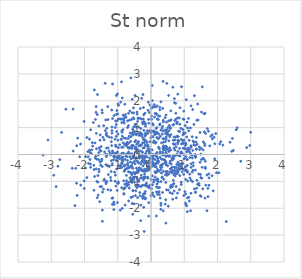
| Category | Series 0 |
|---|---|
| -1.3569650203321348 | -0.379 |
| 0.006356040473439961 | -0.929 |
| 0.8148992307994369 | -0.633 |
| 0.04914036007806821 | 1.147 |
| 0.7065708399965507 | -0.477 |
| 1.0996796094767545 | 0.991 |
| 0.19282079562782428 | -1.482 |
| -0.03461975269364714 | 0.86 |
| 0.671788227664889 | 0.401 |
| -1.106565954318019 | -1.856 |
| -0.4590218435995874 | -1.163 |
| -0.5738741017841402 | -1.031 |
| 1.328260649342905 | 0.003 |
| 0.9598398278082749 | 0.928 |
| -0.10118900537914133 | -0.599 |
| -1.5026205602880651 | 0.134 |
| 0.6862633648643675 | -1.079 |
| 0.9495481328740167 | 0.519 |
| 0.19692176842302533 | -0.558 |
| -0.7882388213198581 | 1.871 |
| 0.7043078636196238 | 2.08 |
| -0.4103651872947349 | 0.784 |
| 1.3653940784192162 | 0.206 |
| 0.8031301679113474 | 0.395 |
| 1.0600271277994917 | 2.04 |
| 1.2528530756783285 | 1.675 |
| 1.1362462216888245 | 0.881 |
| -1.2568011099916863 | -0.44 |
| -0.7914838416924264 | -1.244 |
| 0.9108364341493704 | -0.342 |
| 0.807118988078674 | 0.457 |
| 0.12080695868342506 | -0.187 |
| -2.7433004410158253 | -0.193 |
| 0.2002037047067473 | -0.241 |
| 1.5185559602940506 | 1.579 |
| 1.555214914672412 | -0.14 |
| 0.28294432959679217 | 0.683 |
| -2.558783319268257 | 1.685 |
| -0.710855905186107 | 0.367 |
| 0.3525347179412659 | 1.715 |
| -0.5808574724087103 | -0.399 |
| -0.8364611551904035 | 0.279 |
| 0.17087346446996143 | 1.489 |
| -0.19563439505006386 | -0.325 |
| -1.5664046584031377 | -0.553 |
| -0.030903933906101244 | 0.064 |
| -0.39129987650884956 | 1.337 |
| 0.0031459721022430998 | -0.044 |
| -2.144437188149859 | -0.085 |
| -0.1046991852085819 | -0.856 |
| -1.0034448918451169 | -0.086 |
| 1.1654362814987778 | -0.115 |
| -1.7540181281621852 | 0.311 |
| -0.679229379894859 | -0.641 |
| 1.8404018918960974 | 0.732 |
| 0.5796670368642882 | -0.544 |
| -0.2070027178607834 | -1.591 |
| -0.7319070663677847 | -0.976 |
| 0.91039075943109 | -0.477 |
| 2.0412393491312297 | -0.68 |
| -0.18899029103460663 | -0.289 |
| 1.204709160239024 | 0.009 |
| 0.6717195258271129 | -0.961 |
| 1.040500877615191 | -1.807 |
| -0.7853011980402105 | -0.407 |
| -1.0955542118806791 | -0.04 |
| -0.1586011173040589 | -1.628 |
| -0.4962520945124895 | -1.036 |
| -0.981333639614121 | -1.02 |
| -0.842064161357599 | 1.468 |
| 0.3835170772631322 | 0.177 |
| -3.0983232618258425 | 0.538 |
| 2.590603917351956 | 0.995 |
| 1.4532276110866071 | 0.28 |
| 0.5674830210801796 | -0.059 |
| -1.7646560157441673 | 0.441 |
| 0.5970841817975945 | 0.739 |
| 0.01939545836672618 | 1.305 |
| 1.3546970831572116 | 0.467 |
| 0.6826008580655811 | 1.117 |
| 1.4370740384418248 | -1.08 |
| -0.8149376009017271 | -1.455 |
| -0.2864518141983021 | -0.092 |
| -0.11429622696074304 | 0.316 |
| -0.5786931852286017 | -0.756 |
| -0.3055631367314442 | -1.882 |
| 0.8249430991804791 | -0.413 |
| 0.8420430736593909 | 0.505 |
| -0.3210313439767365 | 1.711 |
| 0.9890970320306449 | 0.772 |
| 0.7637245482020916 | -0.488 |
| -0.8639692721415351 | 2.102 |
| 0.18377636989333368 | -0.642 |
| -0.8823612111811112 | -1.236 |
| -1.542984723063137 | -1.755 |
| 0.356756857927496 | 0.079 |
| -2.008568444538983 | -0.982 |
| 1.3328812047494765 | -0.06 |
| 0.29787308365173626 | -1.005 |
| 0.21934793240234995 | -1.02 |
| 0.3463396989648677 | -1.413 |
| -1.0358017163294795 | -0.206 |
| -0.4838926365272611 | -0.727 |
| 1.2643684481030881 | -0.585 |
| -1.015224539292607 | -1.335 |
| 0.27540433459510716 | -1.619 |
| -1.5581904528860395 | 0.245 |
| 0.8628572167440041 | 0.857 |
| 1.5686674717828204 | 0.171 |
| 0.37112721158568984 | 0.183 |
| -0.07257727977033568 | 1.305 |
| -0.1200977932865337 | 0.449 |
| -0.08333788853140245 | -0.482 |
| -0.17324948049165645 | 0.7 |
| -0.8756405087615367 | -0.211 |
| 0.1775344771091234 | 0.829 |
| 2.5644699277990437 | 0.922 |
| -0.4597219029816948 | 0.522 |
| -0.20551400202101533 | -0.63 |
| 0.12580574859873117 | -0.36 |
| 0.5713162177043278 | 1.01 |
| 1.8710760869010556 | -1.355 |
| -1.4133741205979584 | -0.966 |
| -1.032052030066323 | -0.23 |
| 0.6646641497285906 | -1.116 |
| 1.0903247404691871 | -0.19 |
| 0.4761044203867115 | 2.646 |
| 0.7444088316903876 | 1.903 |
| -2.0112183899333997 | 1.228 |
| -0.14618302166071295 | -0.079 |
| 0.16921521325629474 | -0.064 |
| 0.03995161930661162 | -0.793 |
| 0.4578228455276294 | -0.367 |
| 0.4664716923237586 | -0.706 |
| 1.0017752823133996 | 0.233 |
| -1.6145173328592373 | 1.484 |
| -1.8873444617791364 | -0.088 |
| 0.2321729815499225 | 0.76 |
| -0.42101674483554685 | 1.581 |
| -1.5740797654693983 | -0.196 |
| -0.19327168677371276 | -0.007 |
| -0.6944435965257592 | 0.26 |
| 0.19702453567939138 | -0.618 |
| -0.3899118153615362 | -0.657 |
| -0.25163121907946984 | 0.436 |
| 0.2666616192376461 | 1.661 |
| -0.09485576777742821 | -0.326 |
| -0.4405971734120815 | 1.017 |
| 0.3384891708457465 | 0.006 |
| 0.050839637186568254 | -0.433 |
| 0.2663168848057156 | 1.758 |
| -0.22686557085535863 | 1.746 |
| 0.7558686001838257 | 0.279 |
| 0.6980457688738992 | -0.032 |
| 0.2062310480901326 | -0.306 |
| -0.14991267719938683 | 0.51 |
| -0.21125973277107413 | -0.845 |
| -0.3003824027320503 | -0.361 |
| 0.2980006424915267 | -1.813 |
| 0.08738917168113147 | 0.863 |
| -0.2745075608604237 | 0.102 |
| -0.0796968138808909 | 1.944 |
| 0.12426326788083397 | -0.013 |
| -1.4655700322920762 | 1.553 |
| 1.0199995960614388 | -1.382 |
| -1.3749309435690193 | 0.888 |
| 1.9155449809798277 | -0.162 |
| -1.1643241245564626 | 0.025 |
| -1.1306168575364177 | -0.198 |
| -0.6851075945304927 | 0.592 |
| 0.8715544613965545 | 1.741 |
| -1.1734631151761414 | 0.794 |
| 0.6448661031104397 | -0.156 |
| -0.36205575551163083 | 0.316 |
| 1.0927785065771074 | -2.125 |
| -0.48884688076941885 | 0.785 |
| -1.0290841223338045 | -0.536 |
| -0.8149125576553597 | -1.475 |
| -0.043848368878236066 | -0.493 |
| 0.4650915551428936 | 0.821 |
| -0.17392629078604216 | 0.787 |
| -0.1388889697815925 | -1.09 |
| -2.2202502793864642 | -1.522 |
| -0.5681282796367029 | 0.235 |
| -1.7161162259796967 | -1.332 |
| 1.4763447354538952 | -0.293 |
| -1.2139705324194443 | -0.855 |
| -0.4469453380708419 | 0.734 |
| -0.7927537529023105 | 1.405 |
| 0.15458029293942133 | 1.524 |
| 0.45438003053593157 | -0.387 |
| 0.032427157806004026 | 1.732 |
| 0.18367150859286419 | 0.806 |
| 0.9878870664891153 | 1.613 |
| 0.7387643172796725 | 0.645 |
| 0.8300857416904757 | 0.866 |
| -0.8149269265208972 | 1.33 |
| -0.06881849942841001 | -1.223 |
| -0.22058226168801465 | 1.479 |
| 0.446679390481032 | -0.024 |
| -1.5297627290415274 | -0.279 |
| -0.1994223044123018 | 0.258 |
| 0.37206134702960725 | 1.215 |
| 1.495333496889157 | -0.86 |
| -1.3289428661624907 | 0.977 |
| 0.9097615339422847 | -1.03 |
| -1.719306095122283 | -0.401 |
| -0.24660894753896567 | -0.071 |
| -0.03400142318483379 | 1.839 |
| 2.374838114780786 | 0.455 |
| -0.8401790997057308 | -0.241 |
| 0.29512080582486355 | -2.037 |
| -0.20078954687226425 | -0.553 |
| -2.342383188233569 | 1.689 |
| -0.19395534265980086 | -0.733 |
| -0.06820275241850648 | -1.793 |
| 1.135940656186003 | -1.591 |
| -0.006781675103190388 | 0.618 |
| -0.9382736289784122 | -0.426 |
| -1.6501770631185586 | 1.785 |
| -1.1560484516813583 | 2.622 |
| 0.0916183563652373 | 0.827 |
| -1.1204660357170741 | -1.77 |
| -0.4734719483342813 | 1.101 |
| -0.7987815588056772 | -0.432 |
| 0.45487909951630545 | -0.294 |
| -1.7786689394177797 | 0.172 |
| 1.2687928035628833 | -0.308 |
| 0.1591088896695778 | 0.023 |
| -1.254141704212043 | -0.441 |
| 0.11180195366978296 | -0.448 |
| 0.27866633678066055 | 0.102 |
| -0.22162174291727865 | 0.593 |
| 1.3999324533436353 | -1.11 |
| -0.2545877841741051 | -0.217 |
| 0.6434814032128351 | -0.204 |
| 1.3337582851999334 | -1.408 |
| -0.10022527710954687 | 0.358 |
| 0.4489807956637204 | 0.311 |
| -0.40722238954236367 | -0.57 |
| -0.389737338265852 | -1.161 |
| -0.3345099033839034 | 0.34 |
| -0.2298253984235643 | 1.319 |
| 0.8918686343393887 | 0.055 |
| 0.3110841351803062 | -0.172 |
| -0.17920375739778827 | 1.137 |
| -0.26815697819640505 | 0.75 |
| 1.4345374995352342 | -0.725 |
| 0.27109453220482305 | -0.101 |
| -2.688863391053198 | 0.821 |
| -1.4624618209609235 | -2.068 |
| -0.7389304169857205 | -0.778 |
| 1.597516759096953 | -0.172 |
| 0.8317721069067847 | -0.032 |
| -0.1703082536020597 | -1.377 |
| 0.04063326769772235 | 2.004 |
| 0.362202558265059 | 0.214 |
| -0.6181330236262861 | -0.279 |
| 1.1645045761463626 | 0.083 |
| 2.968900739700363 | 0.337 |
| -0.2945304366403185 | -0.768 |
| -0.8815685132368696 | 0.263 |
| 0.502810108682433 | -0.422 |
| 0.05775610180297619 | 0.655 |
| -0.5114572054452688 | 1.326 |
| 0.7285537345856721 | -0.798 |
| 1.3606156868743007 | 0.189 |
| -0.8395399992619348 | 0.925 |
| 0.2433801158409814 | 0.242 |
| 0.027201288687796144 | 0.174 |
| -0.20558685613520566 | -2.862 |
| 1.043115016500237 | -0.926 |
| -0.4786161485938294 | -0.712 |
| 0.9835464379817074 | 0.81 |
| -0.34470653594922585 | -0.582 |
| -1.3334461049609931 | -1.001 |
| 1.0254961978952561 | -0.469 |
| -0.8922813723107197 | 0.567 |
| -1.8515456132976649 | 0.572 |
| 0.8748611411727492 | -0.059 |
| 1.2003399392597647 | -1.444 |
| 0.9243790728020631 | 0.064 |
| -0.8391832738809573 | -0.089 |
| -0.7163378007539025 | 0.454 |
| -0.6001643323499337 | -1.6 |
| -2.26521576289394 | -0.512 |
| -1.6465182993535876 | 0.787 |
| -0.933415094509118 | 1.326 |
| 0.14879651897364887 | 0.766 |
| 1.096039661845193 | -0.655 |
| -0.8622249292282316 | 0.681 |
| -0.25740979747856585 | 1.187 |
| 0.3166759182671477 | 0.432 |
| -0.35251166129040445 | -0.494 |
| -1.6084403427528988 | 2.231 |
| -0.15255478671634215 | -0.607 |
| -0.7514076494285034 | 1.382 |
| -0.25663130827934033 | 0.081 |
| 0.1800897645984305 | -0.297 |
| -0.6275305656398364 | 0.797 |
| 0.37728700558763517 | 0.324 |
| -0.09114574505353534 | 0.21 |
| -1.0400191756299808 | 0.064 |
| 0.15420685548065105 | 1.772 |
| -0.9088653474915906 | -0.491 |
| -1.8794873447995384 | -0.33 |
| -0.9946792161274285 | 0.533 |
| -0.5757318717760294 | -1.035 |
| 0.960734780546006 | -0.334 |
| 1.4877614101535919 | -0.744 |
| 0.6968035846690022 | -1.359 |
| 1.618946071910492 | 0.331 |
| 1.0852917971216263 | 1.206 |
| -0.16393808058719994 | 1.054 |
| -0.7741367884599697 | -0.181 |
| 0.5884055215407908 | 0.968 |
| -0.4681889705198232 | -1.526 |
| 1.2639653907782158 | 0.506 |
| -0.4212422992931275 | -0.872 |
| 0.8662614206129549 | -0.785 |
| 1.0924810777085776 | -0.407 |
| -0.09046267429745392 | 1.647 |
| -2.2384407911941433 | -1.07 |
| 0.791834963286961 | -0.684 |
| 0.12528923303936335 | -0.84 |
| -0.33977470661820863 | 0.797 |
| -1.041194072682516 | 1.493 |
| 2.8796103253241796 | 0.259 |
| 0.17528265381005337 | 0.632 |
| -1.8436710022769542 | 0.084 |
| 0.4274245987630927 | -0.231 |
| -0.5841629587515982 | -0.443 |
| 0.3273257334833426 | -0.473 |
| -0.23834630103560261 | 2.232 |
| -0.9084849881761858 | 1.316 |
| 0.5413274536144002 | 0.883 |
| 0.03981146252362677 | -1.489 |
| -1.5967317974248454 | -0.782 |
| 0.267418756952722 | 0.057 |
| -0.6090129839345879 | -0.931 |
| 0.44955134400121377 | 0.081 |
| -0.024671016009597757 | -1.138 |
| 0.4343590803510038 | 0.171 |
| 0.1442523515874754 | -0.368 |
| -0.5268556666548836 | -0.664 |
| 0.9352145235506537 | -0.647 |
| 0.3748609234667786 | -0.628 |
| -1.0236381631932945 | 1.634 |
| -0.5866729513811171 | 1.301 |
| -0.37784251369667743 | -0.585 |
| -0.570859990960705 | 1.552 |
| -1.1829473780507955 | 0.332 |
| -1.1971450231351382 | -0.635 |
| -1.0370727290206423 | 0.053 |
| 0.19293006913598099 | -0.262 |
| -0.742740885672168 | 0.007 |
| -1.3187465758035053 | 0.691 |
| 0.4448549233622163 | -1.04 |
| -0.13623391988483835 | -1.071 |
| 1.463907543147963 | 0.183 |
| 0.7847122996926004 | 0.681 |
| -1.5337274982554892 | 0.16 |
| 1.7402444595352273 | -0.723 |
| -0.8863132341577584 | 2.704 |
| 1.510611918865325 | 0.232 |
| 0.5443692646014924 | 0.149 |
| -0.6765482020805438 | 1.532 |
| 1.0718413398494393 | -1.911 |
| -0.6763589811141051 | 1.073 |
| -1.2941865925648068 | 1.297 |
| -0.05265347393474684 | 0.883 |
| -0.5185953439340842 | -0.905 |
| 0.5998799900317611 | -1.223 |
| -0.568943626587437 | 0.028 |
| -0.12495195857430286 | -0.084 |
| 0.7564860418200166 | 1.325 |
| -0.9855905141354846 | 1.318 |
| -0.522438254044423 | 0.324 |
| 0.3859516926858042 | -0.924 |
| 0.9902723187265075 | -0.166 |
| 2.4299417083595856 | 0.116 |
| -0.4356830900167292 | -0.506 |
| 0.640524738606584 | -1.199 |
| 0.6666091894088488 | -0.144 |
| -0.6521915658224513 | -1.25 |
| -0.23611255946540943 | -0.424 |
| 0.25067663907994486 | 0.214 |
| -0.2130971378054065 | 0.899 |
| 0.8053316844995635 | 0.532 |
| 0.25444913231714317 | -1.493 |
| -0.3686370128955705 | -0.316 |
| -1.5861710595597387 | -1.512 |
| -0.0315862150373194 | -0.494 |
| -0.5198222979466207 | -0.931 |
| -0.9902083086782687 | -0.071 |
| 0.4475125193359979 | -2.551 |
| -0.39789260373760005 | -0.273 |
| -1.4566299340724083 | -1.398 |
| 1.7135402599272114 | -1.568 |
| -1.4799041681625917 | -0.175 |
| -0.41636258953774963 | 1.501 |
| -0.9391466333202425 | 0.363 |
| -1.046320235889258 | 1.118 |
| -0.44252447687775387 | 0.087 |
| -0.17548777549610062 | 0.696 |
| 1.575279919592619 | 0.468 |
| -0.04994418908231246 | -0.317 |
| 1.0963065594414534 | -1.614 |
| -1.4442916391899763 | 0.639 |
| 1.8446758546354092 | 0.582 |
| -1.628602744154306 | -1.005 |
| 1.1040370764666179 | 0.239 |
| -0.09734027856574468 | 0.787 |
| -0.5392322418235782 | -1.35 |
| -0.6479069126455244 | -0.492 |
| -1.8219954852608788 | -0.355 |
| -0.17777130082683623 | 0.342 |
| -2.9238276405078207 | -0.771 |
| -0.2101687013839415 | -1.139 |
| 0.356896262934578 | -0.182 |
| 0.8353419160284155 | -0.52 |
| 0.06329468755391598 | -0.165 |
| -0.4764000445180958 | -0.348 |
| 0.969310679614865 | 0.41 |
| 0.5660899267427331 | 0.657 |
| -1.8484130919071164 | 0.164 |
| -0.7689661504584429 | -0.558 |
| 1.2035125921695204 | -0.955 |
| -0.19259013468334096 | -0.321 |
| 1.0283137306157695 | 1.075 |
| -0.6257837530309294 | -0.661 |
| -0.749566117114659 | 0.391 |
| -0.05560723391617017 | -0.565 |
| 0.960331781002564 | 0.732 |
| 1.767424808381599 | 0.322 |
| -0.37466009811275036 | -0.949 |
| -1.1744917589433541 | 0.892 |
| -0.36105018464578276 | 0.709 |
| -0.49569360382947725 | -0.251 |
| -0.25770508577819484 | -1.569 |
| -0.6577890138587783 | 0.681 |
| -0.8641014448609132 | -0.339 |
| 0.1839302275606789 | 1.81 |
| 0.7473124373674587 | 1.534 |
| -0.246886799930226 | -1.633 |
| -0.7932078688160153 | -1.258 |
| 1.9477987460746595 | 0.781 |
| -1.3012866632064828 | 1.782 |
| -1.533002255244842 | 0.533 |
| -0.2805369379963709 | 2.091 |
| 0.10760828038276582 | 1.392 |
| -0.6060086813150196 | 2.85 |
| 2.1606963232695584 | 0.348 |
| 0.28843328774679033 | -0.474 |
| 2.0681844684098323 | 0.395 |
| 0.2582064082142388 | 1.104 |
| -1.1714684879804498 | -1.631 |
| -1.0101834158967176 | 2.251 |
| 0.3873488500660889 | 0.594 |
| -1.0313587735327534 | 0.856 |
| 0.47265688925231153 | 0.837 |
| 0.01742966692255532 | 0.889 |
| 0.6088136343068786 | -0.641 |
| 0.27248096123008025 | 1.138 |
| 0.5957069820441889 | 1.623 |
| -0.18537493034689323 | -0.122 |
| 0.21098016034790223 | -1.236 |
| 1.6283709725845386 | 1.532 |
| -2.118985717150946 | 0.388 |
| 0.014712059637290942 | 1.433 |
| 1.6053500377270256 | 0.844 |
| -1.6654276511887849 | -0.071 |
| -1.1221057451059577 | -0.08 |
| -0.8657571029591367 | -2.005 |
| -1.583759487340667 | -0.019 |
| -0.0707639179404822 | -2.293 |
| 0.38151574509154784 | 0.462 |
| 0.5779557223261236 | -0.652 |
| 0.24811857320001351 | -0.621 |
| -0.6228532208089863 | 0.02 |
| 0.7167294497838652 | 1.267 |
| -1.0104065919391134 | -1.788 |
| -0.9361462462310071 | -0.148 |
| 1.3688976867558136 | 0.635 |
| -0.926741792910037 | -2.071 |
| -0.44064166259902215 | 0.22 |
| 0.7735137646827379 | -0.367 |
| 0.12191473913954809 | 0.84 |
| -1.1559206109729816 | 1.338 |
| 0.9659681798938422 | 0.433 |
| 1.3414728055495546 | -0.102 |
| 1.9698732481567571 | -0.678 |
| -1.5658075095292272 | 1.057 |
| -1.9291926926921255 | 0.632 |
| 0.5869296552083743 | -1.215 |
| -0.9767809996907557 | 1.832 |
| 0.12932891350230946 | 0.42 |
| 0.18996217721528108 | 1.318 |
| -1.1601040711354385 | -1.858 |
| 0.36840009864699663 | 1.274 |
| 0.10332764863658284 | 1.779 |
| 0.3276915665490119 | -0.385 |
| 0.5985964341741266 | -0.518 |
| 0.050022944263217184 | 1.772 |
| -0.4028954274028038 | 1.231 |
| -0.27087713204278785 | 0.664 |
| 0.9021929242821951 | 0.972 |
| 0.7185240007111116 | 0.164 |
| 0.6672519167468067 | 0.532 |
| 0.9877804299275166 | -0.003 |
| 0.8223812475464394 | 0.661 |
| 0.39647992848104696 | 0.249 |
| -1.2107439576490835 | -1.329 |
| -0.5815856604435563 | 0.334 |
| -1.7338722944960923 | 1.19 |
| -0.5401206451904201 | -0.132 |
| -0.31317820009470676 | 0.344 |
| -0.7906604148198078 | -0.575 |
| 0.686629258151636 | -0.149 |
| 0.3139283674233315 | -0.689 |
| -0.3076369783844477 | 0.968 |
| -0.0721105204664978 | -1.204 |
| -1.003879484140585 | 1.507 |
| 1.039486130813362 | 0.201 |
| 1.0782008260998959 | -0.423 |
| 0.9113179787507235 | 0.09 |
| 1.2042215285785458 | 0.325 |
| 0.20847233049109803 | -0.318 |
| -0.5389249518158428 | -0.088 |
| 1.6323937160523894 | -0.476 |
| 0.8517066146371777 | 1.357 |
| -1.3168237633836757 | -0.006 |
| -0.7325660381796073 | -1.069 |
| 0.14965974646583824 | 0.456 |
| 1.0304372486722073 | 0.803 |
| -1.4889469428170345 | -1.195 |
| 0.18819760219971648 | -0.907 |
| -1.38095270695527 | 2.65 |
| 1.0912883647076077 | -0.616 |
| 0.7279503017403828 | -0.681 |
| -0.2347970162352171 | 1.208 |
| -0.47808060540945974 | 0.218 |
| -0.5248086085363539 | 1.546 |
| -0.8051697815041754 | -0.624 |
| 1.2349170578457551 | -0.029 |
| 0.46654727757039804 | -1.314 |
| -0.06557908642193766 | -0.422 |
| -1.4611612469994695 | -2.486 |
| -0.538811750218243 | 0.726 |
| -1.2904728125143858 | 0.244 |
| -0.8051946359654858 | 1.17 |
| -0.273371881430613 | -0.586 |
| 0.07550314075853937 | 0.874 |
| 2.097310604843587 | 0.48 |
| 0.5659853450354131 | -0.321 |
| 0.046522304343376675 | -1.129 |
| 1.0714844365952727 | 0.649 |
| 0.49639467904679613 | 0.798 |
| -0.5067948648694287 | 0.869 |
| 0.5451251837384028 | -0.055 |
| 0.07962095255507773 | -0.017 |
| -1.1104683257525316 | 1.448 |
| -0.7277677704814849 | -1.176 |
| 0.09142078306122592 | 0.507 |
| -1.2149288122413058 | -0.017 |
| -1.481877513432325 | -0.237 |
| -0.11361831384834975 | 0.882 |
| 0.5934163348437727 | 0.162 |
| 0.2978955896655906 | -1.889 |
| -0.3964798515114456 | 0.43 |
| 1.495211995994202 | 0.013 |
| 1.4040191955815855 | 1.878 |
| 1.3326002622809323 | -0.582 |
| -0.48450988765957526 | 0.474 |
| -0.16487502326688563 | 1.148 |
| -1.4295674572579484 | -1.288 |
| -0.39767154331733945 | 0.028 |
| -0.8616513814849007 | 0.046 |
| -1.075794992263317 | 0.046 |
| -1.346854948740556 | -1.045 |
| -0.0008271241672792584 | -1.531 |
| 0.9168567818612194 | 2.521 |
| -0.5882737574379462 | 0.235 |
| 1.2391208756735121 | -0.653 |
| 1.172109303459635 | -0.876 |
| -0.4431421457124456 | 0.097 |
| 0.5230306219473153 | -0.063 |
| -0.049239437904859074 | -0.137 |
| 2.4766648692908415 | 0.153 |
| -1.0458116188473214 | 0.674 |
| 0.817854387478036 | -0.584 |
| -0.20136392262256653 | 1.209 |
| 2.7000219986624767 | -0.251 |
| 0.5773973549858882 | -0.244 |
| 0.7403964199707769 | -0.661 |
| -2.287946483330712 | -1.901 |
| 1.1441609314858692 | 0.526 |
| -1.1952920763750932 | -0.232 |
| -0.1873748750113986 | -0.097 |
| -0.3290295732447266 | -1.535 |
| -0.3092593156105359 | -2.461 |
| 1.6100866067134643 | 0.402 |
| -0.544500736350555 | -0.515 |
| 0.9911733735007129 | 1.312 |
| 0.8582476551233533 | 0.226 |
| 0.29895234738660204 | 1.961 |
| -1.2604412247378907 | 0.652 |
| -0.34702716647223397 | -0.057 |
| -0.9414112438506042 | -0.016 |
| -1.897208308360102 | 0.107 |
| 0.017437302501206453 | -1.274 |
| -1.6959638282298872 | -0.818 |
| 0.2566909589351196 | -1.224 |
| -1.6516916150008623 | 1.568 |
| -0.22816533413030182 | -0.935 |
| 0.7967034901011925 | -1.437 |
| -0.27603181064826376 | 1.314 |
| -1.0393724987552417 | 2.194 |
| -0.1510623860844218 | -0.549 |
| -0.19307299319332216 | -0.597 |
| 0.059159157444593546 | -0.324 |
| -0.09223516669363985 | -1.194 |
| -0.2706958508082735 | -0.266 |
| -0.5280844105189546 | -0.066 |
| -0.3275315876349989 | 0.133 |
| -0.5637324705425577 | 0.753 |
| 0.18049373680285896 | -1.097 |
| -0.9164904321689482 | -0.407 |
| 0.8008111912809808 | -0.704 |
| -0.3527317237145331 | -0.07 |
| 0.021565313523877805 | 0.022 |
| -0.20269862250447623 | 0.567 |
| 0.9644865055536993 | 0.232 |
| -1.3437773826288888 | -0.082 |
| 1.3365048887511461 | -0.101 |
| -0.41264248950157345 | -0.677 |
| 0.33877327738290486 | -0.837 |
| -0.7417649347924726 | 0.327 |
| 1.4483876921733243 | -1.145 |
| 0.4246324473037024 | 0.906 |
| 0.4831394397790536 | -0.775 |
| -1.3159399078926795 | -0.401 |
| 1.8365330385729877 | -0.791 |
| -0.05181518615647196 | 1.565 |
| -0.433608076838083 | 0.087 |
| -1.2818468006643542 | -0.745 |
| 0.22692789044096084 | 0.271 |
| 0.36698407115761356 | -2.096 |
| -1.1916201113903861 | 0.477 |
| 1.8965270158907481 | 0.639 |
| -0.3072780991455195 | -1.196 |
| -0.9831828771634585 | 0.255 |
| -0.467503722770676 | -0.146 |
| -0.5510972439233646 | 0.936 |
| -2.3411009404883076 | 0.127 |
| 0.11081816367362496 | -0.35 |
| 0.24386533820809841 | -1.385 |
| 0.7196955687704198 | 0.535 |
| -0.8249112911457761 | 0.043 |
| -0.6727086550937278 | -1.126 |
| 0.7561556150971924 | -0.709 |
| 0.08157399201437876 | -0.94 |
| 0.536467669871814 | 0.114 |
| 0.6071854517512953 | -0.354 |
| 1.129161773301309 | 1.341 |
| 1.4834454950707094 | -1.531 |
| -2.7991653202233606 | -0.438 |
| -0.2588342225891589 | -0.612 |
| -0.6019831971412097 | 0.661 |
| -1.0712832237651702 | 1.006 |
| 0.5500609467529296 | 1.082 |
| 2.265064394029169 | -2.495 |
| 0.6292387100013537 | -0.141 |
| 1.1036187604405043 | -0.985 |
| 0.06908280535661238 | 1.097 |
| -0.22994968009334293 | 0.566 |
| 0.1668285105997871 | -1.205 |
| 0.33136253925364567 | 0.979 |
| 1.5923832003945684 | 1.514 |
| 0.8083092403110488 | 0.115 |
| -1.7969198355009999 | 0.04 |
| 1.3787559464767165 | 1.276 |
| 0.2303210956809867 | 1.427 |
| -0.07796367254969638 | 0.297 |
| 0.6398386291621039 | -0.642 |
| -0.09738471028272233 | -0.85 |
| -0.7878469521591596 | -1.106 |
| -0.663459365954191 | -1.033 |
| -0.9817771653165615 | -1.075 |
| -0.81829707638581 | 1.249 |
| -0.5485115203367057 | -1.568 |
| 1.6327915844691034 | -0.25 |
| -0.3677779714706224 | 1.024 |
| 1.0717771498113953 | 0.095 |
| 0.005801470787631047 | 1.721 |
| 0.4320301175985648 | 0.476 |
| 0.49194146498785063 | -0.003 |
| -0.35015247056544485 | -0.135 |
| -1.3491600293055948 | 0.729 |
| 1.5261637203747078 | -0.882 |
| -0.37323755908129286 | -1.013 |
| 1.474711777085588 | 0.817 |
| 0.3702400952432976 | 0.877 |
| 1.3347343153858624 | 0.338 |
| 0.511078459058087 | 1.001 |
| -1.3364043075725283 | 0.237 |
| 1.5037931190190346 | -1.559 |
| 0.09590627499095294 | 1.857 |
| -0.6616192694092504 | 0.232 |
| -0.6711816351217879 | -1.73 |
| 0.43719703552094735 | 0.784 |
| -0.6998504688150078 | 0.046 |
| -0.2190151992562539 | -1.465 |
| -1.5679498622387014 | 0.071 |
| -0.5596678027674109 | -0.904 |
| -0.42408788846624823 | -1.234 |
| -1.06305465176096 | 1.249 |
| -0.6989209718112246 | -0.51 |
| 0.7062581885709589 | -0.585 |
| 0.24193113030005797 | 0.62 |
| -0.8940300501299099 | 0.563 |
| 1.54167377390913 | 2.515 |
| -0.7515672979464787 | -0.065 |
| -3.244486554623718 | -0.023 |
| 0.44693796069039227 | 0.226 |
| 0.4949321020801154 | -0.631 |
| -0.42729720381015124 | 0.381 |
| -1.0932734529508839 | -0.657 |
| -0.514419854981158 | -1.836 |
| -1.07141705100375 | -0.771 |
| 0.32821205521617713 | -0.858 |
| -1.563043157558342 | -0.641 |
| -0.058623334738585164 | 0.063 |
| 0.6595206939533522 | -0.074 |
| 0.06972768861007062 | 0.452 |
| -0.5533255442925649 | 0.331 |
| 0.705608201001092 | 1.931 |
| 0.45260800668974266 | 1.467 |
| -0.24272003866825287 | -0.162 |
| 1.7115886303702519 | -1.259 |
| -0.14215332581659368 | -1.174 |
| -0.5480429223716436 | -0.312 |
| -1.3515106834579722 | -1.085 |
| -0.629661794230369 | -0.863 |
| 1.152524821697198 | -1.733 |
| -0.2708720971247054 | -0.024 |
| -0.5438643537199797 | -1.344 |
| -0.19425821533504184 | -0.886 |
| -0.5408617527148722 | -0.852 |
| 0.7852396174696255 | -0.593 |
| 0.773648418043102 | 1.185 |
| -1.3368027416696702 | 0.796 |
| 0.04259196422356304 | -0.257 |
| 0.6930926687380019 | 0.233 |
| -0.1298336054011262 | 0.128 |
| -0.15812196280668633 | 0.043 |
| -0.3923455220706282 | 0.428 |
| 0.8679688138427251 | -0.546 |
| 0.033908856382423025 | 2.568 |
| -0.7679258216142522 | 1.485 |
| 0.21741633882517952 | 0.585 |
| -0.3198306561889801 | 1.344 |
| 1.6401246775221603 | 0.784 |
| -0.046450381205754177 | 0.11 |
| -1.9722011710690444 | -0.499 |
| -0.6350990600655084 | 1.62 |
| 1.271445077593663 | -0.419 |
| 1.040098847895874 | 0.427 |
| -0.992163029071083 | 1.88 |
| -1.235889142665454 | 0.048 |
| -0.8823855785598349 | -0.098 |
| 0.45859256832854634 | 0.656 |
| 1.648304890255547 | -1.141 |
| -0.4447951387301643 | -0.12 |
| 0.43431122797012556 | 0.228 |
| 0.7897894283452196 | 1.21 |
| -0.7123251234740149 | -0.378 |
| -0.3117385863023454 | 0.809 |
| -0.24403494533014314 | 1.136 |
| -1.648661304362106 | -0.536 |
| -1.0067301404227909 | 0.091 |
| -0.8118830949724671 | 0.614 |
| -0.05257482092233179 | -1.242 |
| 0.07794848060967308 | -1.028 |
| 1.5569403908885047 | -1.279 |
| 0.988999260046123 | -1.528 |
| 1.189469822326915 | -2.09 |
| 0.013764475556217626 | 0.68 |
| 0.3557017577643524 | -0.353 |
| 0.030587411652258645 | 0.168 |
| 1.387490318495379 | 0.381 |
| -0.504197770244482 | -0.845 |
| -1.9291598482349395 | -0.861 |
| -1.2059996592627487 | -0.968 |
| -0.17997483886881138 | 1.533 |
| -0.723648094271887 | -0.079 |
| -0.3682081279029674 | -1.173 |
| -1.1491615126455095 | 0.085 |
| 0.12323992228270164 | 1.524 |
| -1.4102472398275454 | 0.544 |
| -0.17890645375680236 | -1.656 |
| 0.47827668246086397 | 0.756 |
| 0.7260783417286367 | 0.386 |
| 0.5614612854009051 | 0.244 |
| -0.6415069942844731 | -0.082 |
| -0.8223557321458665 | -1.287 |
| 1.6958930999603297 | 0.964 |
| -1.0527377971335863 | 0.297 |
| -0.4770648848733048 | 2.199 |
| -1.0561107948998831 | -1.173 |
| 1.0846007798675874 | -0.184 |
| -1.6177544244985933 | -1.607 |
| -0.38117770357485625 | 1.355 |
| -1.5946647443755166 | -1.029 |
| -0.3872171350326825 | -0.96 |
| 0.631748936229588 | -0.671 |
| 1.289270374343281 | 0.356 |
| -0.09437339406668066 | -0.88 |
| 0.16138706310893447 | -2.287 |
| -0.26867761321178385 | -1.153 |
| 0.42203139591762007 | -0.31 |
| -0.7042884467391959 | -0.224 |
| 0.22060072200197478 | 1.298 |
| -1.8331752920201287 | -0.188 |
| -0.9946510008642351 | -0.423 |
| -2.0049201583247753 | -1.264 |
| -2.1129825393817536 | -1.138 |
| 0.28863537392709926 | -0.406 |
| -0.6105722717290138 | 0.491 |
| 0.39953627747833753 | -0.012 |
| -1.1661973191396182 | -0.344 |
| 0.3417475608663798 | 0.762 |
| -0.17554757411535782 | -0.835 |
| -0.7062290607466233 | 1.002 |
| 1.2520339747005842 | 0.152 |
| -0.8390776388541106 | 0.436 |
| 0.4004152083936532 | 0.258 |
| -0.24181873690536548 | 0.238 |
| 1.0430076743258132 | -1.47 |
| 0.9139275221082714 | 0.562 |
| 1.799674363982172 | 0.679 |
| 0.15356898711069533 | -0.471 |
| -1.1809786652177188 | 1.655 |
| -0.5491376401234342 | -0.07 |
| 0.9974100696919059 | 0.534 |
| 0.8569293222235563 | -0.351 |
| 1.2913307683187298 | 1.118 |
| 0.2300671504777556 | -0.257 |
| -0.09738291843950364 | -0.444 |
| -0.22608685442649 | -1.489 |
| -1.7037893179833334 | 2.403 |
| -1.6703932354181337 | 1.304 |
| -1.1750685882967735 | 1.024 |
| -0.03260758618065829 | 0.479 |
| -1.3618930073687672 | 0.007 |
| -1.6863861340958977 | 0.431 |
| -0.6012653748678876 | -0.158 |
| 0.3470372195560829 | 1.048 |
| 0.36369968376217443 | 2.72 |
| -0.15667029237494212 | -0.246 |
| 0.9167743972251232 | 0.391 |
| 0.6824227639329932 | -0.748 |
| -0.3075197945354198 | 0.345 |
| -1.3964995889749954 | 0.096 |
| -1.8156130627963325 | 0.919 |
| 0.855703781702065 | -1.311 |
| 1.0346570571531784 | 0.337 |
| 0.704230556005883 | 0.371 |
| 0.873230096229312 | -0.412 |
| 1.2426793492923442 | -0.125 |
| 0.09408118602355842 | -1.559 |
| -0.6497160446403374 | 1.278 |
| -0.7314473906622689 | -0.52 |
| -0.6994333459507684 | -0.327 |
| 0.530371380983393 | 2.197 |
| 0.6912810183130036 | 0.652 |
| 0.5208128117132977 | -1.923 |
| -0.13968908278916548 | -0.308 |
| 0.007980820183034254 | 1.327 |
| 0.09433163544982559 | -0.025 |
| 1.0044183739019914 | -0.153 |
| -0.664606464086333 | 0.428 |
| -0.08031636542716658 | -0.302 |
| 0.42940024579783564 | -1.847 |
| 1.6822830555587496 | -0.762 |
| -0.5655108743801591 | 2.053 |
| 1.7446308260039167 | -0.87 |
| 1.727234981500934 | 0.867 |
| -1.5284198180346005 | -1.195 |
| -0.8550459181649757 | -0.167 |
| 0.7797835089913558 | -0.023 |
| -0.789577415345943 | 0.379 |
| 0.9097318227139395 | -1.115 |
| 0.7192164626068545 | -0.045 |
| 0.6394555733382328 | -0.471 |
| 0.5354178465245187 | 0.507 |
| -1.6339908057927923 | -0.172 |
| 1.2045736721058367 | 1.809 |
| 0.7616603256797596 | -1.614 |
| 0.8060150249489286 | 2.245 |
| 0.21809880999651643 | -0.255 |
| 0.6440207132666895 | -1.454 |
| 1.204304001176368 | -0.348 |
| -0.7249916452063632 | -1.135 |
| -1.5273062103182795 | 0.728 |
| 0.6531299502086352 | -0.597 |
| 1.3402260219292845 | -0.019 |
| -1.710948297783844 | -0.561 |
| -0.13546754699369767 | 0.769 |
| -0.5482544448174265 | -2.224 |
| 0.6012556914742708 | 1.295 |
| 0.2996527030366751 | 0.904 |
| 0.985599127759933 | -0.742 |
| 1.682962514721634 | -2.092 |
| -0.20240485208901138 | -0.219 |
| 0.5332518227446679 | -0.729 |
| 0.16281736724711315 | -1.391 |
| 1.4165473520400536 | 1.28 |
| 0.20883768628218125 | -0.93 |
| -0.37997962623683446 | -0.632 |
| -0.28492447215609573 | -0.281 |
| 1.5169359217602967 | -0.191 |
| -2.854129775345825 | -1.197 |
| -0.8781361477800029 | -0.479 |
| 1.1547298007717428 | 0.191 |
| -0.14654270136926506 | -1.14 |
| 0.3627287102289891 | 0.585 |
| -1.4672546464966647 | -0.449 |
| 0.8052189758614432 | 1.364 |
| 0.3007818351232707 | -0.556 |
| -0.7801285373622644 | -1.883 |
| 0.06082585470109603 | -0.096 |
| -0.21730460871776724 | -1.962 |
| -2.2332874191590184 | 0.324 |
| -1.118583282803332 | -2.049 |
| 1.0477976693544653 | -0.082 |
| -0.3143026374317319 | -0.88 |
| 0.7235725987841937 | -0.488 |
| -0.3055099054329222 | -0.522 |
| 0.17945984981933094 | 0.072 |
| 0.523919245491772 | -1.326 |
| 0.47590830350249824 | 0.272 |
| -0.7727153579950263 | 0.37 |
| 0.04643049558845913 | -1.429 |
| 1.6394096994400575 | -0.518 |
| 1.7441494798442703 | -1.146 |
| -0.5310238325230205 | 1.366 |
| 0.44638467671410975 | 0.298 |
| -0.673691388146838 | -0.44 |
| -0.5196282082358117 | 1.028 |
| -0.0527851849177603 | 0.132 |
| 0.5945346779156555 | -1.147 |
| 0.6575020111898677 | 2.506 |
| 1.2395003029564604 | 0.661 |
| -0.06419699197008111 | 1.163 |
| 1.9207626715848427 | 0.399 |
| -0.2660493660240615 | -0.868 |
| -0.6728181980713908 | 0.091 |
| 0.36521611557502887 | 0.267 |
| -0.44113018296066375 | -0.134 |
| 0.5915343312387211 | 1.273 |
| 1.203713976589853 | 0.279 |
| -0.977459661084815 | -0.052 |
| 1.294213119806483 | 0.454 |
| -0.012768426409523137 | -0.162 |
| -0.4404535866683794 | -0.659 |
| -0.39969970737875204 | 0.184 |
| -0.40398594878084637 | -1.604 |
| 0.7763665731901046 | 0.011 |
| -0.6358060623224828 | 0.261 |
| 0.11926614338180919 | -0.643 |
| -1.0812528492869307 | 0.569 |
| 1.6240665598438753 | -1.623 |
| 0.10810913553371648 | 0.734 |
| 0.15472662408224735 | 0.968 |
| -2.2043293772502435 | 0.608 |
| -0.8821764910371668 | -0.309 |
| -1.260166275097303 | 0.132 |
| -1.0802468483477226 | -0.996 |
| -1.2976448971818044 | -1.312 |
| -0.018740139225698726 | 0.196 |
| 1.5382564852548013 | -0.477 |
| -0.5783064245926228 | -0.957 |
| -1.676275135481685 | -0.135 |
| 0.1360965527326643 | -0.675 |
| 0.26538903060505525 | 1.433 |
| -1.5138107900207114 | -0.396 |
| -0.8171860063884617 | -0.978 |
| 1.1118373585148689 | 0.146 |
| 0.07030623886631648 | -0.395 |
| -0.16303357355527393 | -0.619 |
| -0.555488029371384 | 0.819 |
| 2.9974230126164585 | 0.827 |
| 0.15989749439887468 | -0.956 |
| -0.8693060948294047 | 0.827 |
| -0.3054341940091847 | 0.737 |
| -0.39274571361873 | -1.162 |
| -1.148506358580999 | -1.614 |
| 0.8658680433663744 | 1.126 |
| 1.3423340232628584 | -1.405 |
| -1.1844995911944665 | 0.63 |
| -1.639755998336792 | 0.212 |
| 0.20755506900563336 | -0.15 |
| -1.4016386969668888 | -0.921 |
| 0.44973734658264863 | -0.635 |
| -0.8068394610497327 | -0.412 |
| -0.012892503634844843 | 0.475 |
| -0.9903585788726179 | 0.759 |
| 0.6554213385306138 | -1.665 |
| -0.18530849341323208 | -0.085 |
| 0.1424832138650256 | -0.673 |
| -1.473144889163323 | 1.656 |
| -0.9117566985431509 | 1.948 |
| 0.4547361449160947 | -0.076 |
| -0.42166908976815787 | -0.239 |
| -0.37610254386393915 | 0.482 |
| 0.0313044195432024 | -0.124 |
| -1.1591774442171952 | 0.129 |
| -1.005173234783702 | -1.062 |
| 0.49757275787718225 | 0.2 |
| -0.15775629406612346 | -1.159 |
| -0.09307362821104714 | -1.179 |
| 0.0037829374375260016 | 0.815 |
| -1.0877820475586883 | -0.106 |
| 0.4015968841193196 | -0.193 |
| 0.5339026817173442 | 1.252 |
| -0.5672798073387719 | -1.821 |
| 0.44348997698932635 | -1.684 |
| -0.2877609770553988 | 0.356 |
| 1.0276419018467138 | -0.594 |
| -0.7062506141411067 | 1.252 |
| -1.5035474569805745 | 0.293 |
| -0.18395275229356667 | -1.452 |
| 1.3062239577804498 | 2.189 |
| -2.368072242583386 | -0.512 |
| 0.4717555115929484 | 0.921 |
| 0.7547395327111523 | -1.191 |
| 1.0520301890821129 | -1.869 |
| 0.35488613657909873 | -0.023 |
| 0.9569116068747583 | -0.555 |
| 0.17418305189180483 | 1.002 |
| 0.5291601089905917 | 0.727 |
| 1.2466583456798217 | -1.01 |
| 0.5748215813318822 | -1.421 |
| 1.1864860035454745 | 0.99 |
| -1.4223671180642983 | 1.07 |
| 0.9659014633749843 | 1.32 |
| 0.778972749063545 | 1.154 |
| -1.8175160460539228 | -0.478 |
| -1.3002863313692021 | -0.42 |
| 1.1652784191990966 | -0.732 |
| -0.7536284350037583 | 0.599 |
| 0.4259096036568186 | 1.372 |
| 1.2042090359401154 | -0.48 |
| 0.4329221318442258 | -0.754 |
| -0.591843961798574 | -0.46 |
| 1.1270415526689783 | 0.144 |
| 0.46590629154660324 | 1.205 |
| -0.593719542507495 | -0.701 |
| -1.361273738769845 | 1.286 |
| -0.8660629375953492 | 1.321 |
| -0.45677777689605303 | 0.269 |
| -0.456584593511165 | -1.351 |
| 1.3828645746017942 | -0.96 |
| -0.958814229580323 | -0.145 |
| -0.8792199744072482 | 0.876 |
| 0.9081623602413407 | 0.084 |
| -1.966208206707778 | -0.079 |
| -1.0196576878329013 | 1.249 |
| -1.0166806616859896 | -0.11 |
| -1.0657298137423359 | 0.349 |
| 1.3050039494151262 | -1.281 |
| 0.8102362261189393 | -0.283 |
| -0.5279272238862784 | 1.733 |
| -0.33805488385665594 | -1.414 |
| -0.8807027336666025 | 1.188 |
| -0.8806618577395655 | 0.037 |
| 1.199716704312344 | 0.267 |
| 2.447044933187998 | 0.596 |
| 0.4598691802290267 | 0.572 |
| 1.3744765520866942 | -1.253 |
| -0.19854563011604132 | 0.434 |
| 1.0555378535105548 | 0.389 |
| 1.0529782822990983 | -0.569 |
| 0.6591983830316845 | 1.095 |
| -0.07326738047939507 | -0.568 |
| -0.18714119820377917 | 0.508 |
| 0.21975214229803797 | -1.397 |
| 0.1782935490235884 | -0.095 |